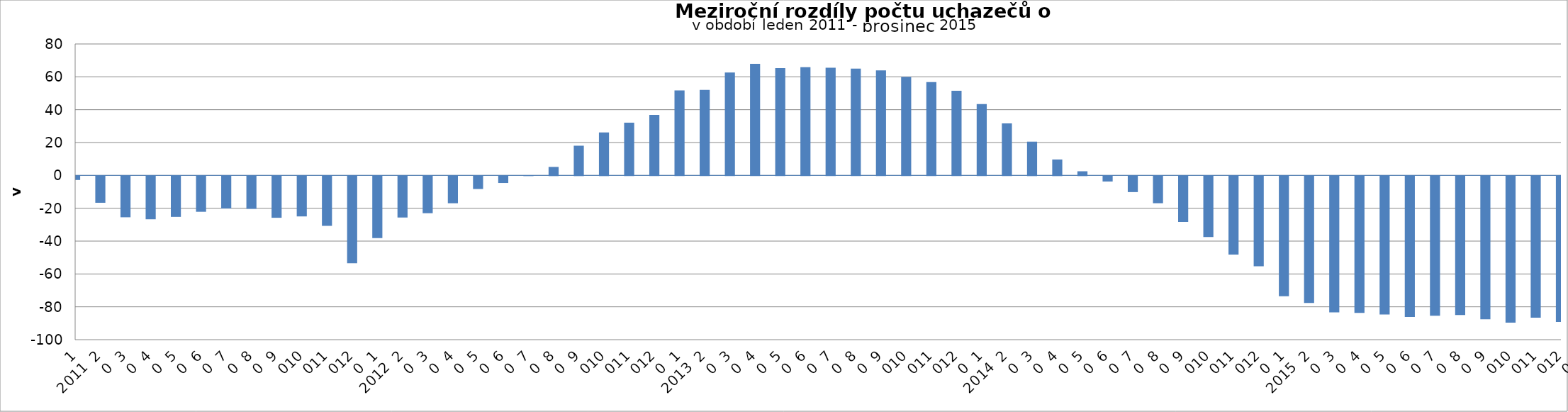
| Category | Series 1 |
|---|---|
| 0 | -2363 |
| 1 | -16239 |
| 2 | -25062 |
| 3 | -26286 |
| 4 | -24823 |
| 5 | -21725 |
| 6 | -19700 |
| 7 | -19959 |
| 8 | -25366 |
| 9 | -24543 |
| 10 | -30236 |
| 11 | -53100 |
| 12 | -37774 |
| 13 | -25211 |
| 14 | -22582 |
| 15 | -16520 |
| 16 | -7857 |
| 17 | -4189 |
| 18 | 13 |
| 19 | 5158 |
| 20 | 18070 |
| 21 | 26144 |
| 22 | 32094 |
| 23 | 36860 |
| 24 | 51720 |
| 25 | 51998 |
| 26 | 62588 |
| 27 | 67906 |
| 28 | 65364 |
| 29 | 65887 |
| 30 | 65499 |
| 31 | 65038 |
| 32 | 63873 |
| 33 | 59919 |
| 34 | 56815 |
| 35 | 51522 |
| 36 | 43465 |
| 37 | 31707 |
| 38 | 20547 |
| 39 | 9680 |
| 40 | 2510 |
| 41 | -3294 |
| 42 | -9732 |
| 43 | -16506 |
| 44 | -27960 |
| 45 | -37043 |
| 46 | -47805 |
| 47 | -54919 |
| 48 | -73083 |
| 49 | -77273 |
| 50 | -83000 |
| 51 | -83323 |
| 52 | -84284 |
| 53 | -85784 |
| 54 | -85023 |
| 55 | -84559 |
| 56 | -87206 |
| 57 | -89206 |
| 58 | -86144 |
| 59 | -88796 |